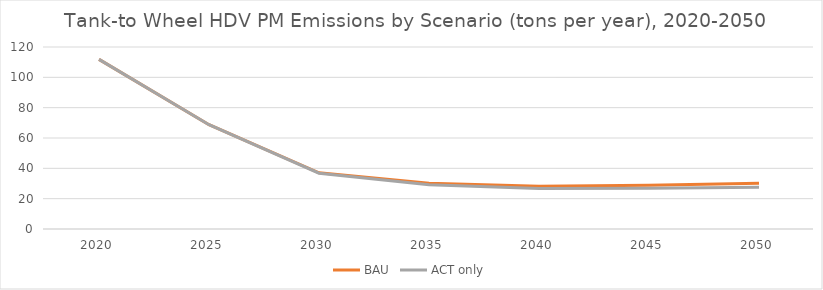
| Category | BAU | ACT only |
|---|---|---|
| 2020.0 | 111.833 | 111.833 |
| 2025.0 | 68.754 | 68.754 |
| 2030.0 | 37.034 | 36.772 |
| 2035.0 | 30.118 | 29.22 |
| 2040.0 | 28.106 | 26.705 |
| 2045.0 | 28.894 | 26.843 |
| 2050.0 | 30.172 | 27.553 |